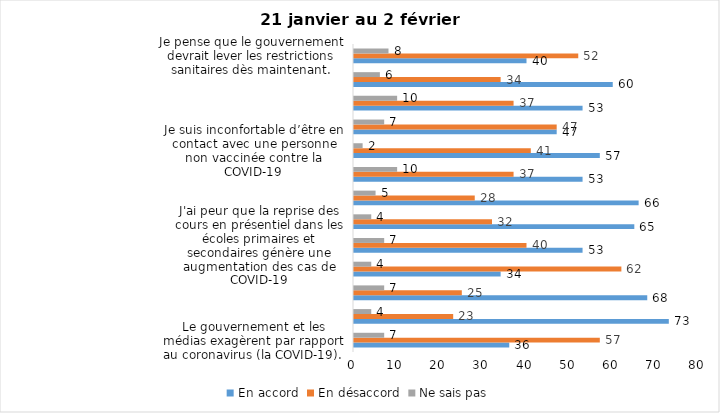
| Category | En accord | En désaccord | Ne sais pas |
|---|---|---|---|
| Le gouvernement et les médias exagèrent par rapport au coronavirus (la COVID-19). | 36 | 57 | 7 |
| J’ai peur que le système de santé soit débordé par les cas de COVID-19. | 73 | 23 | 4 |
| Je suis confiant que la vaccination protège efficacement contre les variants de la COVID-19 | 68 | 25 | 7 |
| Je suis favorable à ce que le port du masque ne soit plus obligatoire au Québec. | 34 | 62 | 4 |
| J'ai peur que la reprise des cours en présentiel dans les écoles primaires et secondaires génère une augmentation des cas de COVID-19 | 53 | 40 | 7 |
| Je crois que le passeport vaccinal devrait être requis pour davantage de services et commerces (ex. : spas, centre d’achats, centre de soins personnels. | 65 | 32 | 4 |
| Les personnes non adéquatement vaccinées contre la COVID-19 sont responsables des nouveaux cas et hospitalisations et contribuent à la prolongation de la pandémie au Québec. | 66 | 28 | 5 |
| La pandémie ne sera pas terminée au Québec avant que tous les habitants de la terre puissent être vaccinés contre la COVID-19.   | 53 | 37 | 10 |
| Je suis inconfortable d’être en contact avec une personne non vaccinée contre la COVID-19 | 57 | 41 | 2 |
| Je n'ai pas peur du variant Omicron, car il semble moins dangereux pour la santé. | 47 | 47 | 7 |
| La vaccination obligatoire contre la COVID-19 mettrait fin à la pandémie. | 53 | 37 | 10 |
| Je suis favorable à ce que les personnes non vaccinées paient une taxe supplémentaire (contribution santé). | 60 | 34 | 6 |
| Je pense que le gouvernement devrait lever les restrictions sanitaires dès maintenant. | 40 | 52 | 8 |